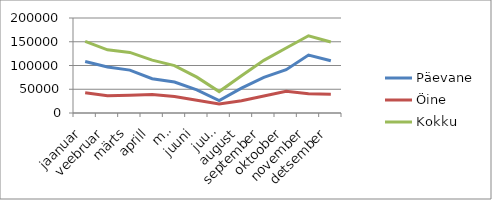
| Category | Päevane | Öine | Kokku |
|---|---|---|---|
| jaanuar | 108380.7 | 42475.6 | 150856.3 |
| veebruar | 96730.8 | 36209.1 | 132939.9 |
| märts | 90245.4 | 37273 | 127518.4 |
| aprill | 72153.6 | 39099.8 | 111253.4 |
| mai | 65209.8 | 34597.8 | 99807.6 |
| juuni | 48745.3 | 26722 | 75467.3 |
| juuli | 26090.941 | 19031.454 | 45122.395 |
| august | 52481.702 | 25992.585 | 78474.287 |
| september | 75055.737 | 35750.086 | 110805.823 |
| oktoober | 91178.696 | 45566.54 | 136745.236 |
| november | 122105.602 | 40426.99 | 162532.592 |
| detsember | 109991.086 | 39488.902 | 149479.988 |